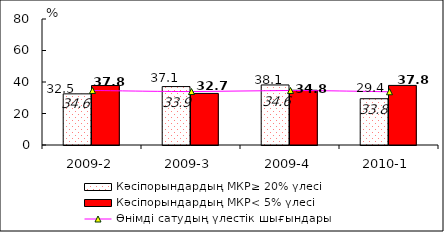
| Category | Кәсіпорындардың МКР≥ 20% үлесі | Кәсіпорындардың МКР< 5% үлесі |
|---|---|---|
| 2009-2 | 32.48 | 37.76 |
| 2009-3 | 37.097 | 32.742 |
| 2009-4 | 38.119 | 34.761 |
| 2010-1 | 29.382 | 37.833 |